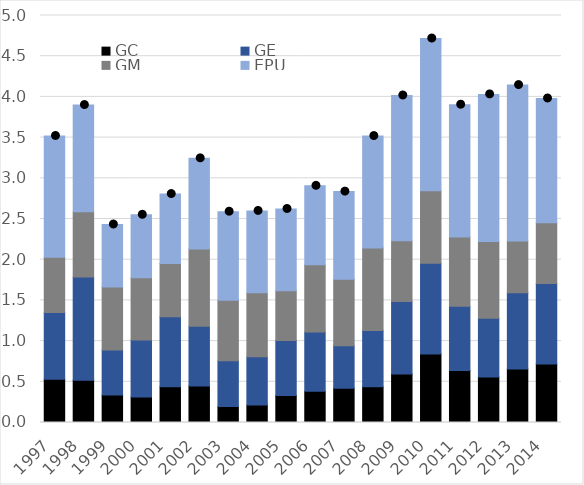
| Category | GC | GE | GM | EPU |
|---|---|---|---|---|
| 1997.0 | 0.53 | 0.821 | 0.68 | 1.489 |
| 1998.0 | 0.518 | 1.269 | 0.804 | 1.309 |
| 1999.0 | 0.337 | 0.553 | 0.773 | 0.769 |
| 2000.0 | 0.312 | 0.7 | 0.765 | 0.774 |
| 2001.0 | 0.438 | 0.862 | 0.654 | 0.852 |
| 2002.0 | 0.449 | 0.732 | 0.949 | 1.114 |
| 2003.0 | 0.195 | 0.562 | 0.746 | 1.086 |
| 2004.0 | 0.214 | 0.594 | 0.784 | 1.006 |
| 2005.0 | 0.332 | 0.676 | 0.61 | 1.006 |
| 2006.0 | 0.382 | 0.728 | 0.827 | 0.97 |
| 2007.0 | 0.421 | 0.521 | 0.817 | 1.078 |
| 2008.0 | 0.44 | 0.692 | 1.011 | 1.376 |
| 2009.0 | 0.596 | 0.891 | 0.746 | 1.784 |
| 2010.0 | 0.841 | 1.114 | 0.893 | 1.869 |
| 2011.0 | 0.637 | 0.79 | 0.853 | 1.624 |
| 2012.0 | 0.56 | 0.719 | 0.942 | 1.808 |
| 2013.0 | 0.659 | 0.935 | 0.635 | 1.917 |
| 2014.0 | 0.718 | 0.989 | 0.747 | 1.527 |